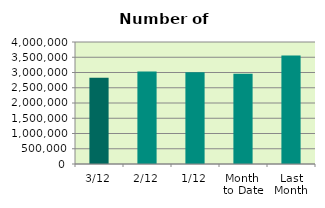
| Category | Series 0 |
|---|---|
| 3/12 | 2824550 |
| 2/12 | 3035980 |
| 1/12 | 3011614 |
| Month 
to Date | 2957381.333 |
| Last
Month | 3558191.714 |